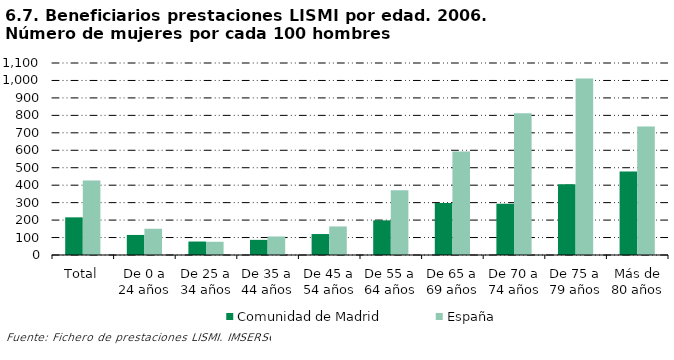
| Category | Comunidad de Madrid | España |
|---|---|---|
| Total | 215.74 | 427.457 |
| De 0 a 24 años | 114.894 | 150.463 |
| De 25 a 34 años | 77.108 | 75.752 |
| De 35 a 44 años | 86.726 | 106.132 |
| De 45 a 54 años | 120.084 | 163.569 |
| De 55 a 64 años | 198.558 | 371.193 |
| De 65 a 69 años | 297.872 | 593.59 |
| De 70 a 74 años | 293.919 | 811.966 |
| De 75 a 79 años | 406.034 | 1011.567 |
| Más de 80 años | 478.448 | 735.543 |